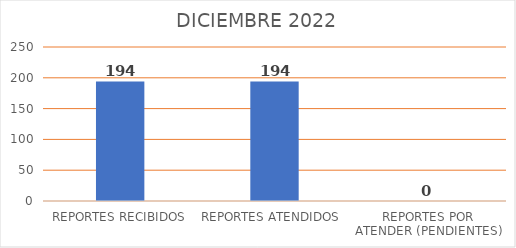
| Category | Series 0 |
|---|---|
| REPORTES RECIBIDOS | 194 |
| REPORTES ATENDIDOS  | 194 |
| REPORTES POR ATENDER (PENDIENTES) | 0 |